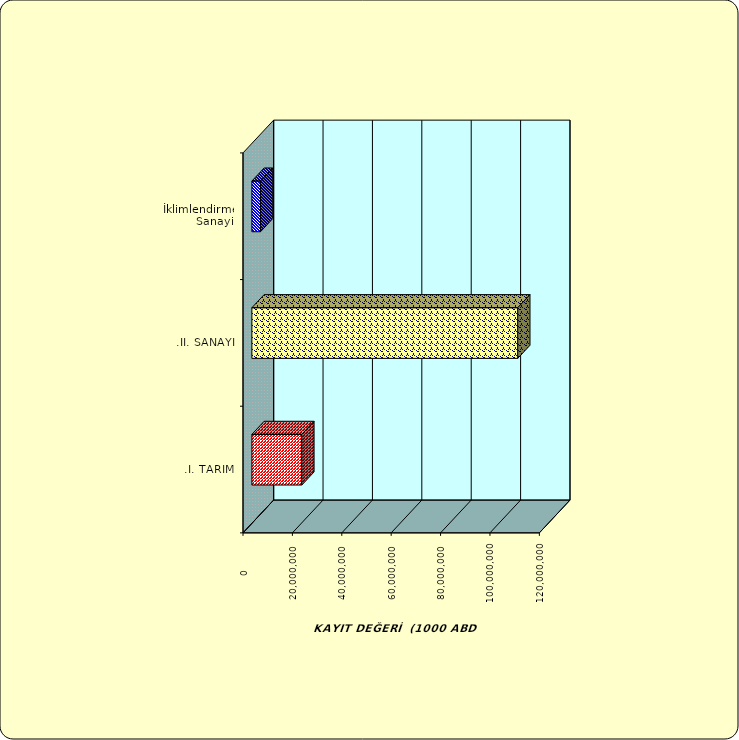
| Category | Series 0 |
|---|---|
| .I. TARIM | 20229167.308 |
| .II. SANAYİ | 107660325.145 |
|  İklimlendirme Sanayii | 3509230.927 |